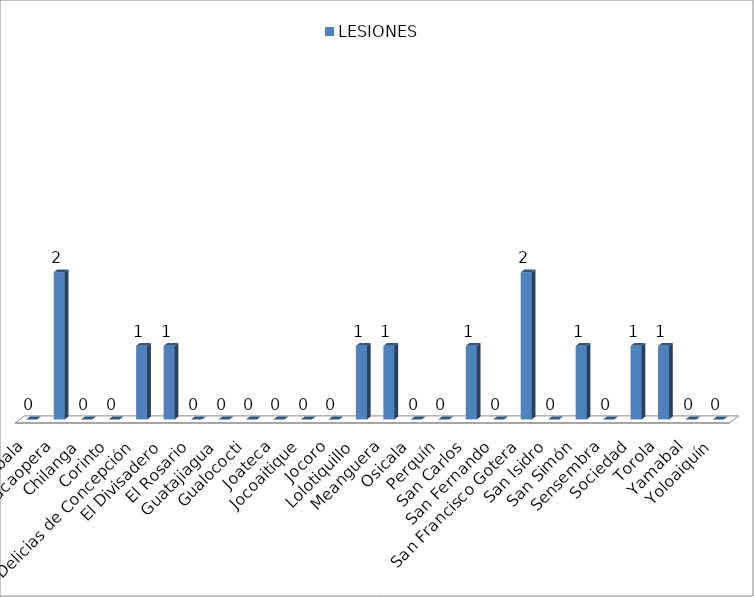
| Category | LESIONES  |
|---|---|
| Arambala | 0 |
| Cacaopera | 2 |
| Chilanga | 0 |
| Corinto | 0 |
| Delicias de Concepción | 1 |
| El Divisadero | 1 |
| El Rosario | 0 |
| Guatajiagua | 0 |
| Gualococti | 0 |
| Joateca | 0 |
| Jocoaitique | 0 |
| Jocoro | 0 |
| Lolotiquillo | 1 |
| Meanguera | 1 |
| Osicala | 0 |
| Perquín | 0 |
| San Carlos | 1 |
| San Fernando | 0 |
| San Francisco Gotera | 2 |
| San Isidro | 0 |
| San Simón | 1 |
| Sensembra | 0 |
| Sociedad | 1 |
| Torola | 1 |
| Yamabal | 0 |
| Yoloaiquín | 0 |